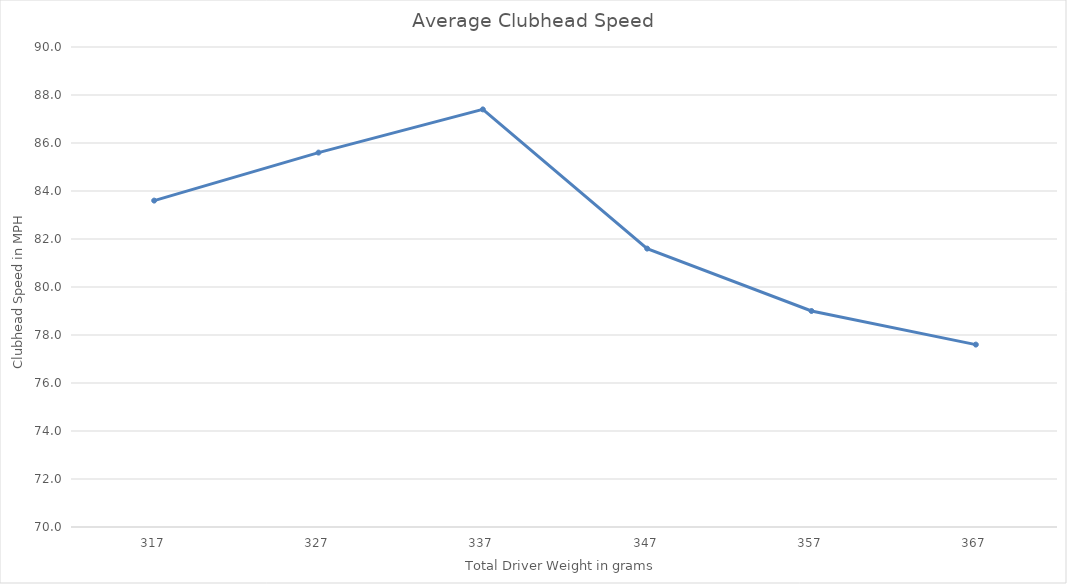
| Category | Clubhead Speed Average |
|---|---|
| 317.0 | 83.6 |
| 327.0 | 85.6 |
| 337.0 | 87.4 |
| 347.0 | 81.6 |
| 357.0 | 79 |
| 367.0 | 77.6 |